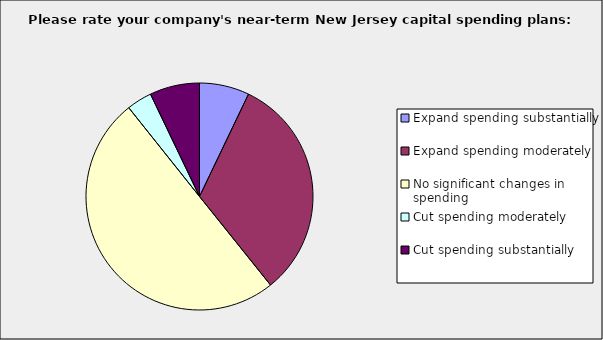
| Category | Series 0 |
|---|---|
| Expand spending substantially | 0.071 |
| Expand spending moderately | 0.321 |
| No significant changes in spending | 0.5 |
| Cut spending moderately | 0.036 |
| Cut spending substantially | 0.071 |